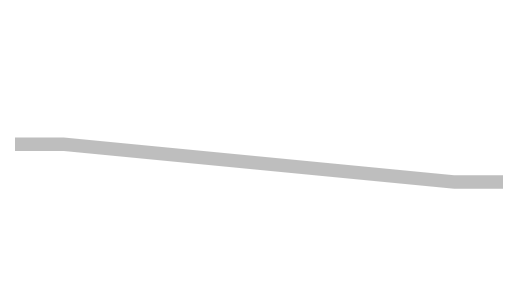
| Category | S1 | S2 | S3 |
|---|---|---|---|
| 0.0 | 910 | 100 | 920 |
| 10.0 | 910 | 100 | 920 |
| 90.0 | 1190 | 100 | 640 |
| 100.0 | 1190 | 100 | 640 |